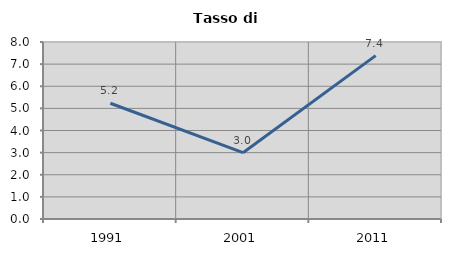
| Category | Tasso di disoccupazione   |
|---|---|
| 1991.0 | 5.232 |
| 2001.0 | 2.997 |
| 2011.0 | 7.385 |